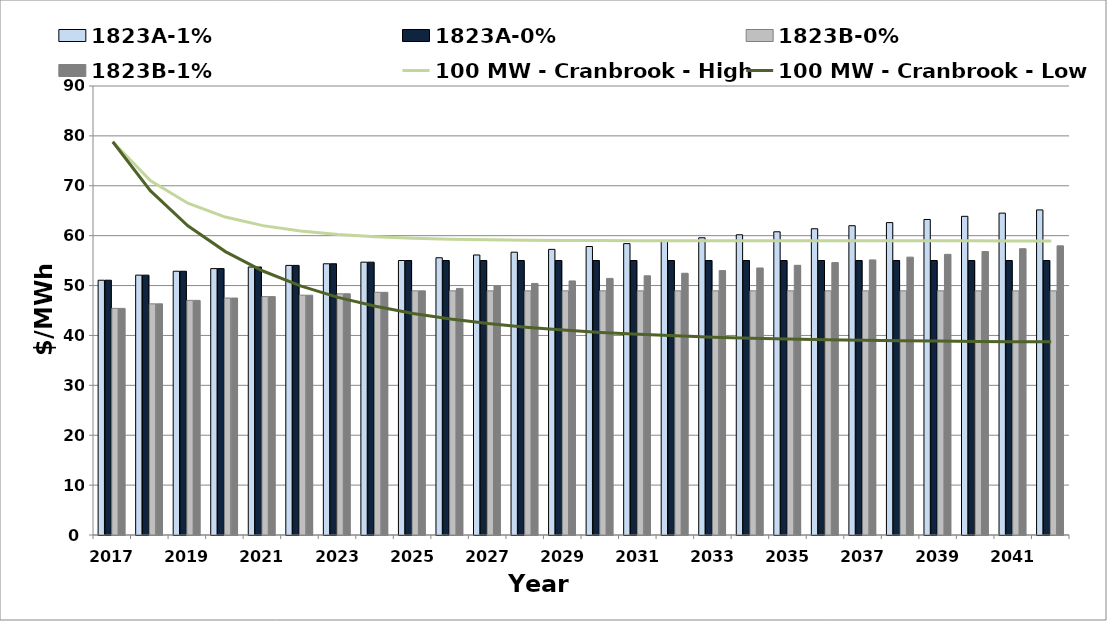
| Category | 1823A-1% | 1823A-0% | 1823B-0% | 1823B-1% |
|---|---|---|---|---|
| 2017.0 | 51.068 | 51.068 | 45.423 | 45.423 |
| 2018.0 | 52.089 | 52.089 | 46.331 | 46.331 |
| 2019.0 | 52.87 | 52.87 | 47.026 | 47.026 |
| 2020.0 | 53.399 | 53.399 | 47.497 | 47.497 |
| 2021.0 | 53.72 | 53.72 | 47.782 | 47.782 |
| 2022.0 | 54.042 | 54.042 | 48.068 | 48.068 |
| 2023.0 | 54.366 | 54.366 | 48.357 | 48.357 |
| 2024.0 | 54.692 | 54.692 | 48.647 | 48.647 |
| 2025.0 | 55.021 | 55.021 | 48.939 | 48.939 |
| 2026.0 | 55.571 | 55.021 | 48.939 | 49.428 |
| 2027.0 | 56.126 | 55.021 | 48.939 | 49.922 |
| 2028.0 | 56.688 | 55.021 | 48.939 | 50.422 |
| 2029.0 | 57.255 | 55.021 | 48.939 | 50.926 |
| 2030.0 | 57.827 | 55.021 | 48.939 | 51.435 |
| 2031.0 | 58.405 | 55.021 | 48.939 | 51.95 |
| 2032.0 | 58.989 | 55.021 | 48.939 | 52.469 |
| 2033.0 | 59.579 | 55.021 | 48.939 | 52.994 |
| 2034.0 | 60.175 | 55.021 | 48.939 | 53.524 |
| 2035.0 | 60.777 | 55.021 | 48.939 | 54.059 |
| 2036.0 | 61.385 | 55.021 | 48.939 | 54.599 |
| 2037.0 | 61.998 | 55.021 | 48.939 | 55.145 |
| 2038.0 | 62.618 | 55.021 | 48.939 | 55.697 |
| 2039.0 | 63.245 | 55.021 | 48.939 | 56.254 |
| 2040.0 | 63.877 | 55.021 | 48.939 | 56.816 |
| 2041.0 | 64.516 | 55.021 | 48.939 | 57.385 |
| 2042.0 | 65.161 | 55.021 | 48.939 | 57.958 |